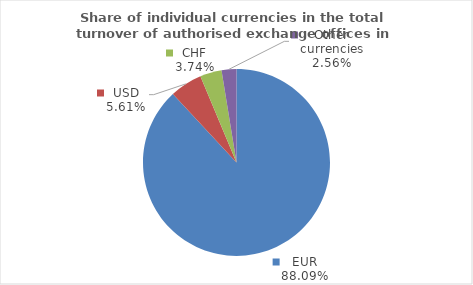
| Category | Series 0 |
|---|---|
| EUR | 88.085 |
| USD | 5.609 |
| CHF | 3.743 |
| Other currencies | 2.563 |